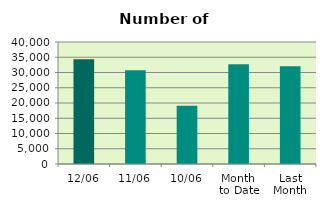
| Category | Series 0 |
|---|---|
| 12/06 | 34370 |
| 11/06 | 30770 |
| 10/06 | 19102 |
| Month 
to Date | 32715.75 |
| Last
Month | 32020.364 |